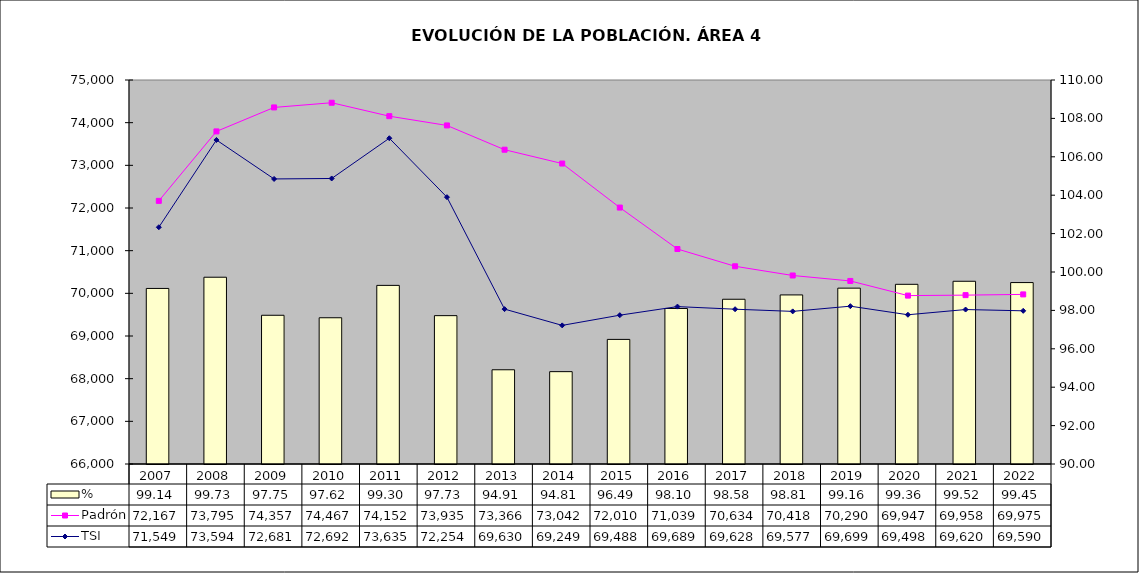
| Category | % |
|---|---|
| 2007.0 | 99.144 |
| 2008.0 | 99.728 |
| 2009.0 | 97.746 |
| 2010.0 | 97.616 |
| 2011.0 | 99.303 |
| 2012.0 | 97.726 |
| 2013.0 | 94.908 |
| 2014.0 | 94.81 |
| 2015.0 | 96.49 |
| 2016.0 | 98.1 |
| 2017.0 | 98.58 |
| 2018.0 | 98.806 |
| 2019.0 | 99.159 |
| 2020.0 | 99.358 |
| 2021.0 | 99.517 |
| 2022.0 | 99.45 |